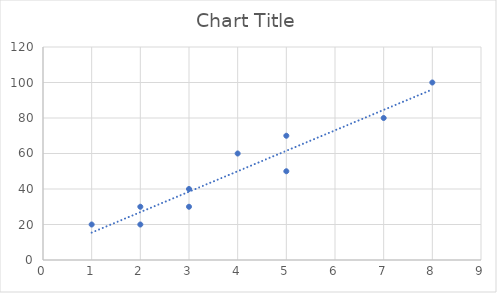
| Category | Series 0 |
|---|---|
| 3.0 | 30 |
| 2.0 | 20 |
| 4.0 | 60 |
| 5.0 | 70 |
| 8.0 | 100 |
| 7.0 | 80 |
| 5.0 | 50 |
| 3.0 | 40 |
| 2.0 | 30 |
| 1.0 | 20 |